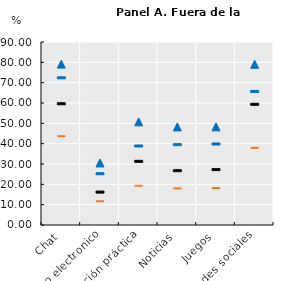
| Category | Series 0 | Series 2 | Series 1 | Series 3 |
|---|---|---|---|---|
| Chat | 43.672 | 59.63 | 72.382 | 79.121 |
| Correo electronico | 11.685 | 16.186 | 25.21 | 30.516 |
| Información práctica | 19.295 | 31.311 | 38.865 | 50.737 |
| Noticias | 18.016 | 26.717 | 39.508 | 48.235 |
| Juegos | 18.193 | 27.246 | 39.841 | 48.26 |
| Redes sociales | 37.948 | 59.369 | 65.677 | 79.038 |